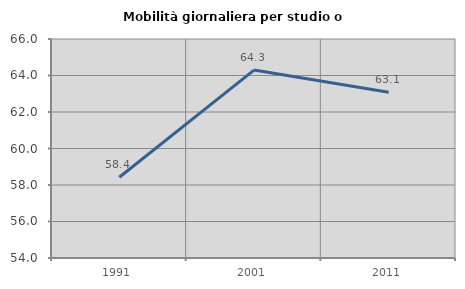
| Category | Mobilità giornaliera per studio o lavoro |
|---|---|
| 1991.0 | 58.424 |
| 2001.0 | 64.299 |
| 2011.0 | 63.085 |